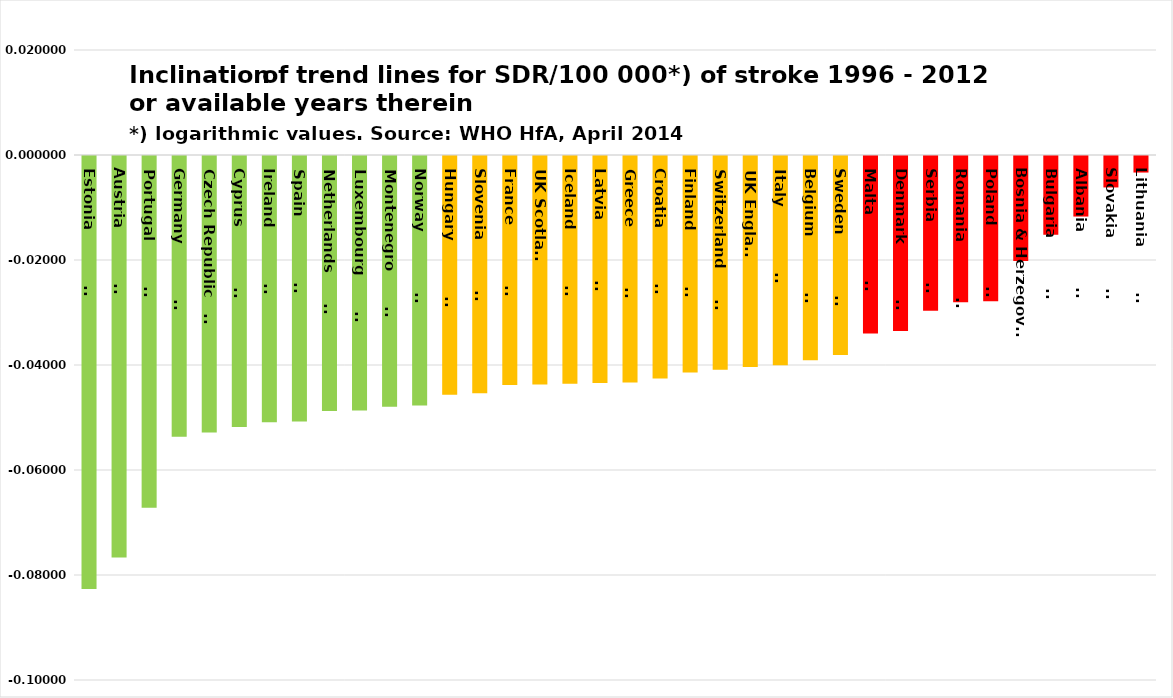
| Category | Series 0 |
|---|---|
| Estonia                | -0.082 |
| Austria                | -0.076 |
| Portugal               | -0.067 |
| Germany                | -0.053 |
| Czech Republic         | -0.053 |
| Cyprus                 | -0.052 |
| Ireland                | -0.051 |
| Spain                  | -0.051 |
| Netherlands            | -0.049 |
| Luxembourg             | -0.048 |
| Montenegro             | -0.048 |
| Norway                 | -0.048 |
| Hungary                | -0.045 |
| Slovenia               | -0.045 |
| France                 | -0.044 |
| UK Scotland | -0.044 |
| Iceland                | -0.043 |
| Latvia                 | -0.043 |
| Greece                 | -0.043 |
| Croatia                | -0.042 |
| Finland                | -0.041 |
| Switzerland            | -0.041 |
| UK England | -0.04 |
| Italy                  | -0.04 |
| Belgium                | -0.039 |
| Sweden                 | -0.038 |
| Malta                  | -0.034 |
| Denmark                | -0.033 |
| Serbia                 | -0.029 |
| Romania                | -0.028 |
| Poland                 | -0.028 |
| Bosnia & Herzegovina | -0.02 |
| Bulgaria               | -0.015 |
| Albania                | -0.012 |
| Slovakia               | -0.006 |
| Lithuania              | -0.003 |